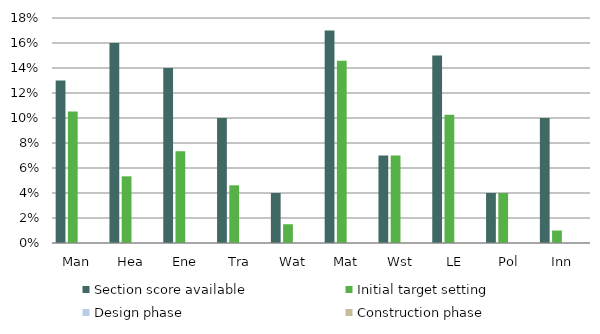
| Category | Section score available | Initial target setting | Design phase | Construction phase |
|---|---|---|---|---|
| Man | 0.13 | 0.105 | 0 | 0 |
| Hea | 0.16 | 0.053 | 0 | 0 |
| Ene | 0.14 | 0.073 | 0 | 0 |
| Tra | 0.1 | 0.046 | 0 | 0 |
| Wat | 0.04 | 0.015 | 0 | 0 |
| Mat | 0.17 | 0.146 | 0 | 0 |
| Wst | 0.07 | 0.07 | 0 | 0 |
| LE | 0.15 | 0.103 | 0 | 0 |
| Pol | 0.04 | 0.04 | 0 | 0 |
| Inn | 0.1 | 0.01 | 0 | 0 |